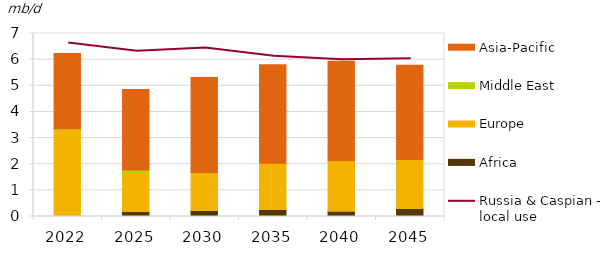
| Category | Africa | Europe | Middle East | Asia-Pacific |
|---|---|---|---|---|
| 2022.0 | 0 | 3.341 | 0.015 | 2.88 |
| 2025.0 | 0.193 | 1.488 | 0.095 | 3.085 |
| 2030.0 | 0.23 | 1.454 | 0 | 3.632 |
| 2035.0 | 0.27 | 1.767 | -0.003 | 3.764 |
| 2040.0 | 0.2 | 1.939 | 0 | 3.798 |
| 2045.0 | 0.307 | 1.873 | 0 | 3.605 |